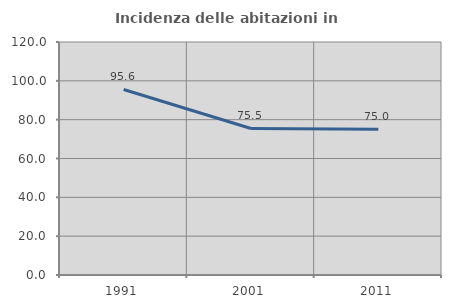
| Category | Incidenza delle abitazioni in proprietà  |
|---|---|
| 1991.0 | 95.559 |
| 2001.0 | 75.466 |
| 2011.0 | 75.038 |